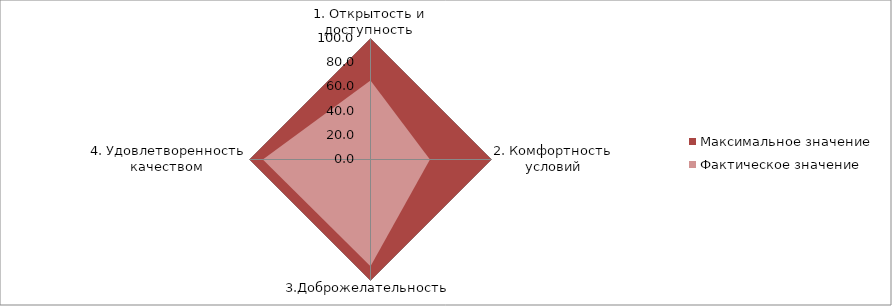
| Category | Максимальное значение | Фактическое значение |
|---|---|---|
| 1. Открытость и доступность  | 100 | 65.219 |
| 2. Комфортность условий | 100 | 49.121 |
| 3.Доброжелательность | 100 | 88.236 |
| 4. Удовлетворенность качеством  | 100 | 88.98 |